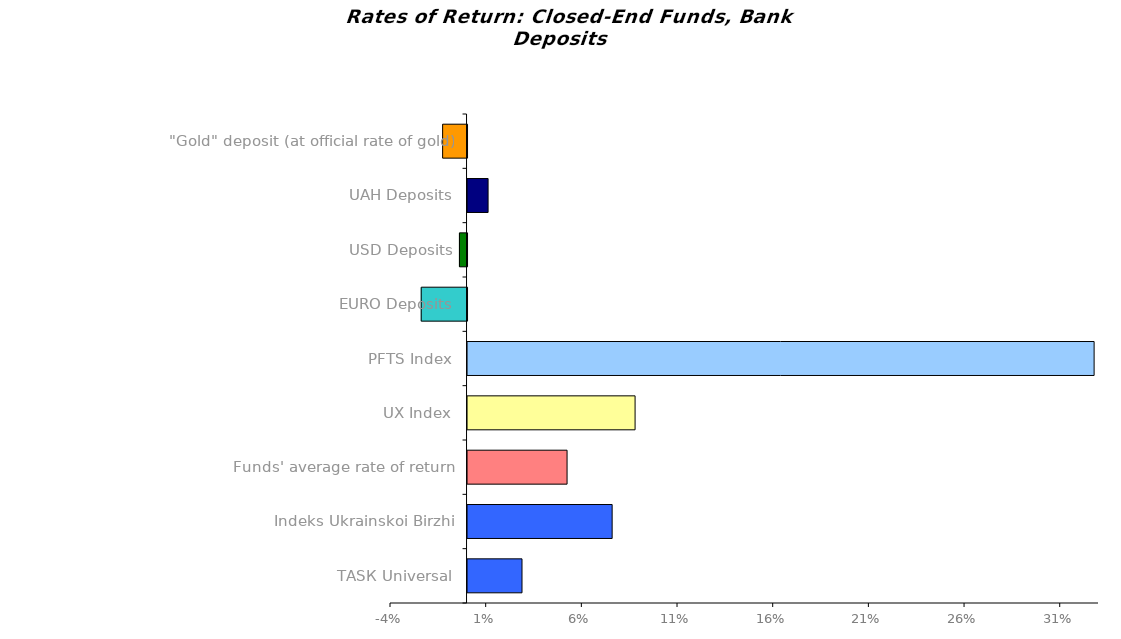
| Category | Series 0 |
|---|---|
| ТАSК Universal | 0.028 |
| Іndeks Ukrainskoi Birzhi | 0.076 |
| Funds' average rate of return | 0.052 |
| UX Index | 0.088 |
| PFTS Index | 0.327 |
| EURO Deposits | -0.024 |
| USD Deposits | -0.004 |
| UAH Deposits | 0.011 |
| "Gold" deposit (at official rate of gold) | -0.013 |